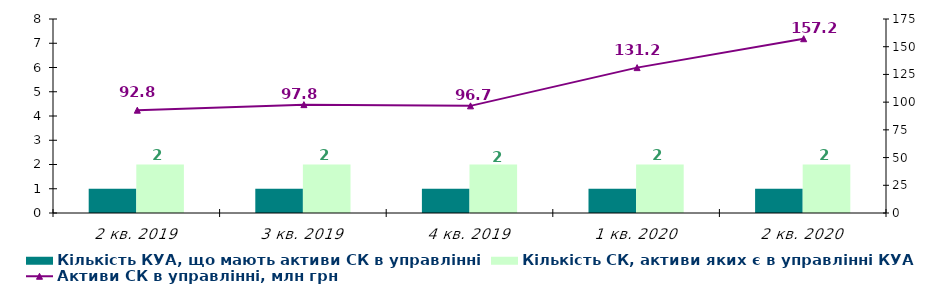
| Category | Кількість КУА, що мають активи СК в управлінні | Кількість СК, активи яких є в управлінні КУА |
|---|---|---|
| 2 кв. 2019 | 1 | 2 |
| 3 кв. 2019 | 1 | 2 |
| 4 кв. 2019 | 1 | 2 |
| 1 кв. 2020 | 1 | 2 |
| 2 кв. 2020 | 1 | 2 |